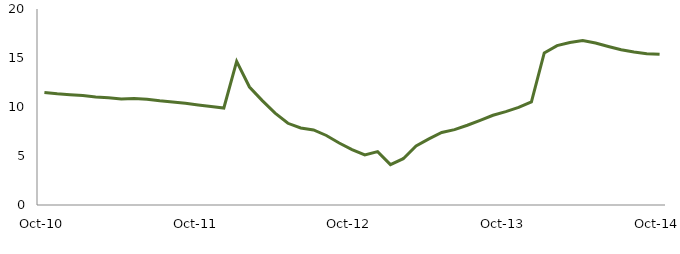
| Category | Series 0 |
|---|---|
| Oct-10 | 11.483 |
|  | 11.344 |
|  | 11.256 |
|  | 11.163 |
|  | 11.031 |
|  | 10.935 |
|  | 10.818 |
|  | 10.872 |
|  | 10.784 |
|  | 10.628 |
|  | 10.504 |
|  | 10.374 |
| Oct-11 | 10.212 |
|  | 10.043 |
|  | 9.898 |
|  | 14.655 |
|  | 12.038 |
|  | 10.656 |
|  | 9.383 |
|  | 8.337 |
|  | 7.859 |
|  | 7.654 |
|  | 7.095 |
|  | 6.329 |
| Oct-12 | 5.655 |
|  | 5.108 |
|  | 5.447 |
|  | 4.125 |
|  | 4.723 |
|  | 6.024 |
|  | 6.741 |
|  | 7.399 |
|  | 7.69 |
|  | 8.139 |
|  | 8.641 |
|  | 9.159 |
| Oct-13 | 9.523 |
|  | 9.953 |
|  | 10.521 |
|  | 15.512 |
|  | 16.267 |
|  | 16.584 |
|  | 16.774 |
|  | 16.523 |
|  | 16.177 |
|  | 15.851 |
|  | 15.603 |
|  | 15.444 |
| Oct-14 | 15.377 |